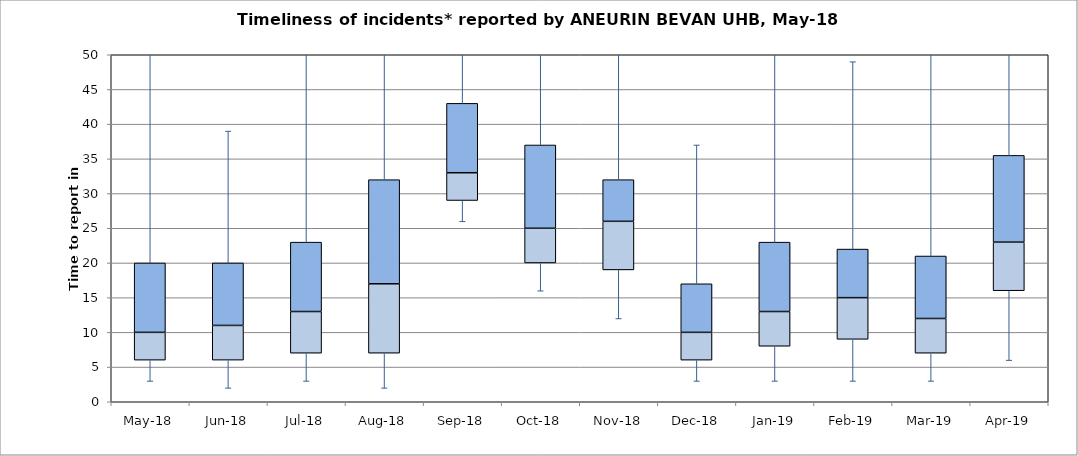
| Category | Series 0 | Series 1 | Series 2 |
|---|---|---|---|
| May-18 | 6 | 4 | 10 |
| Jun-18 | 6 | 5 | 9 |
| Jul-18 | 7 | 6 | 10 |
| Aug-18 | 7 | 10 | 15 |
| Sep-18 | 29 | 4 | 10 |
| Oct-18 | 20 | 5 | 12 |
| Nov-18 | 19 | 7 | 6 |
| Dec-18 | 6 | 4 | 7 |
| Jan-19 | 8 | 5 | 10 |
| Feb-19 | 9 | 6 | 7 |
| Mar-19 | 7 | 5 | 9 |
| Apr-19 | 16 | 7 | 12.5 |